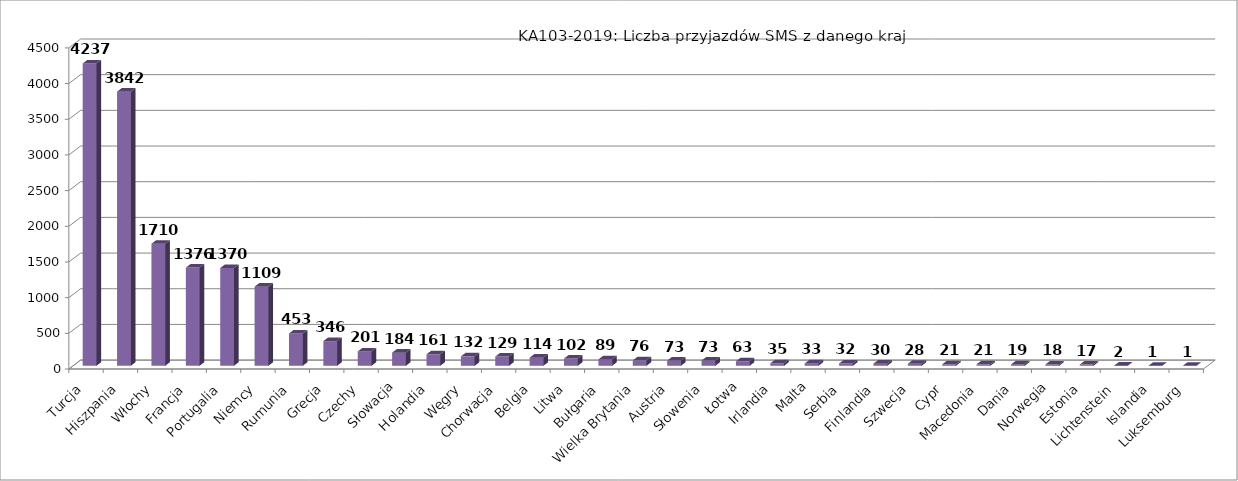
| Category | Liczba przyjazdów SMS |
|---|---|
| Turcja | 4237 |
| Hiszpania | 3842 |
| Włochy | 1710 |
| Francja  | 1376 |
| Portugalia | 1370 |
| Niemcy | 1109 |
| Rumunia | 453 |
| Grecja | 346 |
| Czechy | 201 |
| Słowacja | 184 |
| Holandia | 161 |
| Węgry | 132 |
| Chorwacja | 129 |
| Belgia | 114 |
| Litwa | 102 |
| Bułgaria | 89 |
| Wielka Brytania | 76 |
| Austria | 73 |
| Słowenia | 73 |
| Łotwa | 63 |
| Irlandia | 35 |
| Malta | 33 |
| Serbia | 32 |
| Finlandia | 30 |
| Szwecja | 28 |
| Cypr | 21 |
| Macedonia | 21 |
| Dania | 19 |
| Norwegia | 18 |
| Estonia | 17 |
| Lichtenstein | 2 |
| Islandia | 1 |
| Luksemburg | 1 |